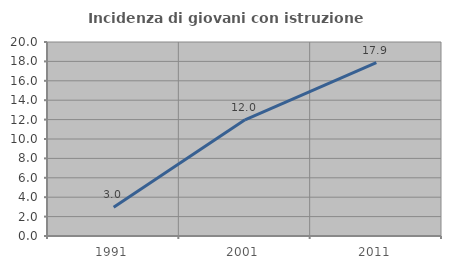
| Category | Incidenza di giovani con istruzione universitaria |
|---|---|
| 1991.0 | 2.959 |
| 2001.0 | 11.979 |
| 2011.0 | 17.877 |